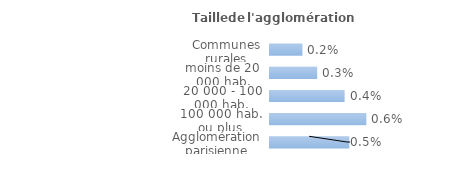
| Category | Series 0 |
|---|---|
| Communes rurales | 0.002 |
| moins de 20 000 hab. | 0.003 |
| 20 000 - 100 000 hab. | 0.004 |
| 100 000 hab. ou plus | 0.006 |
| Agglomération parisienne | 0.005 |